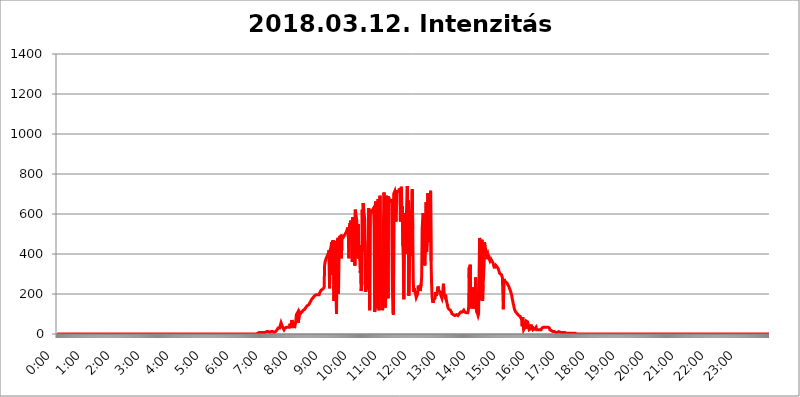
| Category | 2018.03.12. Intenzitás [W/m^2] |
|---|---|
| 0.0 | 0 |
| 0.0006944444444444445 | 0 |
| 0.001388888888888889 | 0 |
| 0.0020833333333333333 | 0 |
| 0.002777777777777778 | 0 |
| 0.003472222222222222 | 0 |
| 0.004166666666666667 | 0 |
| 0.004861111111111111 | 0 |
| 0.005555555555555556 | 0 |
| 0.0062499999999999995 | 0 |
| 0.006944444444444444 | 0 |
| 0.007638888888888889 | 0 |
| 0.008333333333333333 | 0 |
| 0.009027777777777779 | 0 |
| 0.009722222222222222 | 0 |
| 0.010416666666666666 | 0 |
| 0.011111111111111112 | 0 |
| 0.011805555555555555 | 0 |
| 0.012499999999999999 | 0 |
| 0.013194444444444444 | 0 |
| 0.013888888888888888 | 0 |
| 0.014583333333333332 | 0 |
| 0.015277777777777777 | 0 |
| 0.015972222222222224 | 0 |
| 0.016666666666666666 | 0 |
| 0.017361111111111112 | 0 |
| 0.018055555555555557 | 0 |
| 0.01875 | 0 |
| 0.019444444444444445 | 0 |
| 0.02013888888888889 | 0 |
| 0.020833333333333332 | 0 |
| 0.02152777777777778 | 0 |
| 0.022222222222222223 | 0 |
| 0.02291666666666667 | 0 |
| 0.02361111111111111 | 0 |
| 0.024305555555555556 | 0 |
| 0.024999999999999998 | 0 |
| 0.025694444444444447 | 0 |
| 0.02638888888888889 | 0 |
| 0.027083333333333334 | 0 |
| 0.027777777777777776 | 0 |
| 0.02847222222222222 | 0 |
| 0.029166666666666664 | 0 |
| 0.029861111111111113 | 0 |
| 0.030555555555555555 | 0 |
| 0.03125 | 0 |
| 0.03194444444444445 | 0 |
| 0.03263888888888889 | 0 |
| 0.03333333333333333 | 0 |
| 0.034027777777777775 | 0 |
| 0.034722222222222224 | 0 |
| 0.035416666666666666 | 0 |
| 0.036111111111111115 | 0 |
| 0.03680555555555556 | 0 |
| 0.0375 | 0 |
| 0.03819444444444444 | 0 |
| 0.03888888888888889 | 0 |
| 0.03958333333333333 | 0 |
| 0.04027777777777778 | 0 |
| 0.04097222222222222 | 0 |
| 0.041666666666666664 | 0 |
| 0.042361111111111106 | 0 |
| 0.04305555555555556 | 0 |
| 0.043750000000000004 | 0 |
| 0.044444444444444446 | 0 |
| 0.04513888888888889 | 0 |
| 0.04583333333333334 | 0 |
| 0.04652777777777778 | 0 |
| 0.04722222222222222 | 0 |
| 0.04791666666666666 | 0 |
| 0.04861111111111111 | 0 |
| 0.049305555555555554 | 0 |
| 0.049999999999999996 | 0 |
| 0.05069444444444445 | 0 |
| 0.051388888888888894 | 0 |
| 0.052083333333333336 | 0 |
| 0.05277777777777778 | 0 |
| 0.05347222222222222 | 0 |
| 0.05416666666666667 | 0 |
| 0.05486111111111111 | 0 |
| 0.05555555555555555 | 0 |
| 0.05625 | 0 |
| 0.05694444444444444 | 0 |
| 0.057638888888888885 | 0 |
| 0.05833333333333333 | 0 |
| 0.05902777777777778 | 0 |
| 0.059722222222222225 | 0 |
| 0.06041666666666667 | 0 |
| 0.061111111111111116 | 0 |
| 0.06180555555555556 | 0 |
| 0.0625 | 0 |
| 0.06319444444444444 | 0 |
| 0.06388888888888888 | 0 |
| 0.06458333333333334 | 0 |
| 0.06527777777777778 | 0 |
| 0.06597222222222222 | 0 |
| 0.06666666666666667 | 0 |
| 0.06736111111111111 | 0 |
| 0.06805555555555555 | 0 |
| 0.06874999999999999 | 0 |
| 0.06944444444444443 | 0 |
| 0.07013888888888889 | 0 |
| 0.07083333333333333 | 0 |
| 0.07152777777777779 | 0 |
| 0.07222222222222223 | 0 |
| 0.07291666666666667 | 0 |
| 0.07361111111111111 | 0 |
| 0.07430555555555556 | 0 |
| 0.075 | 0 |
| 0.07569444444444444 | 0 |
| 0.0763888888888889 | 0 |
| 0.07708333333333334 | 0 |
| 0.07777777777777778 | 0 |
| 0.07847222222222222 | 0 |
| 0.07916666666666666 | 0 |
| 0.0798611111111111 | 0 |
| 0.08055555555555556 | 0 |
| 0.08125 | 0 |
| 0.08194444444444444 | 0 |
| 0.08263888888888889 | 0 |
| 0.08333333333333333 | 0 |
| 0.08402777777777777 | 0 |
| 0.08472222222222221 | 0 |
| 0.08541666666666665 | 0 |
| 0.08611111111111112 | 0 |
| 0.08680555555555557 | 0 |
| 0.08750000000000001 | 0 |
| 0.08819444444444445 | 0 |
| 0.08888888888888889 | 0 |
| 0.08958333333333333 | 0 |
| 0.09027777777777778 | 0 |
| 0.09097222222222222 | 0 |
| 0.09166666666666667 | 0 |
| 0.09236111111111112 | 0 |
| 0.09305555555555556 | 0 |
| 0.09375 | 0 |
| 0.09444444444444444 | 0 |
| 0.09513888888888888 | 0 |
| 0.09583333333333333 | 0 |
| 0.09652777777777777 | 0 |
| 0.09722222222222222 | 0 |
| 0.09791666666666667 | 0 |
| 0.09861111111111111 | 0 |
| 0.09930555555555555 | 0 |
| 0.09999999999999999 | 0 |
| 0.10069444444444443 | 0 |
| 0.1013888888888889 | 0 |
| 0.10208333333333335 | 0 |
| 0.10277777777777779 | 0 |
| 0.10347222222222223 | 0 |
| 0.10416666666666667 | 0 |
| 0.10486111111111111 | 0 |
| 0.10555555555555556 | 0 |
| 0.10625 | 0 |
| 0.10694444444444444 | 0 |
| 0.1076388888888889 | 0 |
| 0.10833333333333334 | 0 |
| 0.10902777777777778 | 0 |
| 0.10972222222222222 | 0 |
| 0.1111111111111111 | 0 |
| 0.11180555555555556 | 0 |
| 0.11180555555555556 | 0 |
| 0.1125 | 0 |
| 0.11319444444444444 | 0 |
| 0.11388888888888889 | 0 |
| 0.11458333333333333 | 0 |
| 0.11527777777777777 | 0 |
| 0.11597222222222221 | 0 |
| 0.11666666666666665 | 0 |
| 0.1173611111111111 | 0 |
| 0.11805555555555557 | 0 |
| 0.11944444444444445 | 0 |
| 0.12013888888888889 | 0 |
| 0.12083333333333333 | 0 |
| 0.12152777777777778 | 0 |
| 0.12222222222222223 | 0 |
| 0.12291666666666667 | 0 |
| 0.12291666666666667 | 0 |
| 0.12361111111111112 | 0 |
| 0.12430555555555556 | 0 |
| 0.125 | 0 |
| 0.12569444444444444 | 0 |
| 0.12638888888888888 | 0 |
| 0.12708333333333333 | 0 |
| 0.16875 | 0 |
| 0.12847222222222224 | 0 |
| 0.12916666666666668 | 0 |
| 0.12986111111111112 | 0 |
| 0.13055555555555556 | 0 |
| 0.13125 | 0 |
| 0.13194444444444445 | 0 |
| 0.1326388888888889 | 0 |
| 0.13333333333333333 | 0 |
| 0.13402777777777777 | 0 |
| 0.13402777777777777 | 0 |
| 0.13472222222222222 | 0 |
| 0.13541666666666666 | 0 |
| 0.1361111111111111 | 0 |
| 0.13749999999999998 | 0 |
| 0.13819444444444443 | 0 |
| 0.1388888888888889 | 0 |
| 0.13958333333333334 | 0 |
| 0.14027777777777778 | 0 |
| 0.14097222222222222 | 0 |
| 0.14166666666666666 | 0 |
| 0.1423611111111111 | 0 |
| 0.14305555555555557 | 0 |
| 0.14375000000000002 | 0 |
| 0.14444444444444446 | 0 |
| 0.1451388888888889 | 0 |
| 0.1451388888888889 | 0 |
| 0.14652777777777778 | 0 |
| 0.14722222222222223 | 0 |
| 0.14791666666666667 | 0 |
| 0.1486111111111111 | 0 |
| 0.14930555555555555 | 0 |
| 0.15 | 0 |
| 0.15069444444444444 | 0 |
| 0.15138888888888888 | 0 |
| 0.15208333333333332 | 0 |
| 0.15277777777777776 | 0 |
| 0.15347222222222223 | 0 |
| 0.15416666666666667 | 0 |
| 0.15486111111111112 | 0 |
| 0.15555555555555556 | 0 |
| 0.15625 | 0 |
| 0.15694444444444444 | 0 |
| 0.15763888888888888 | 0 |
| 0.15833333333333333 | 0 |
| 0.15902777777777777 | 0 |
| 0.15972222222222224 | 0 |
| 0.16041666666666668 | 0 |
| 0.16111111111111112 | 0 |
| 0.16180555555555556 | 0 |
| 0.1625 | 0 |
| 0.16319444444444445 | 0 |
| 0.1638888888888889 | 0 |
| 0.16458333333333333 | 0 |
| 0.16527777777777777 | 0 |
| 0.16597222222222222 | 0 |
| 0.16666666666666666 | 0 |
| 0.1673611111111111 | 0 |
| 0.16805555555555554 | 0 |
| 0.16874999999999998 | 0 |
| 0.16944444444444443 | 0 |
| 0.17013888888888887 | 0 |
| 0.1708333333333333 | 0 |
| 0.17152777777777775 | 0 |
| 0.17222222222222225 | 0 |
| 0.1729166666666667 | 0 |
| 0.17361111111111113 | 0 |
| 0.17430555555555557 | 0 |
| 0.17500000000000002 | 0 |
| 0.17569444444444446 | 0 |
| 0.1763888888888889 | 0 |
| 0.17708333333333334 | 0 |
| 0.17777777777777778 | 0 |
| 0.17847222222222223 | 0 |
| 0.17916666666666667 | 0 |
| 0.1798611111111111 | 0 |
| 0.18055555555555555 | 0 |
| 0.18125 | 0 |
| 0.18194444444444444 | 0 |
| 0.1826388888888889 | 0 |
| 0.18333333333333335 | 0 |
| 0.1840277777777778 | 0 |
| 0.18472222222222223 | 0 |
| 0.18541666666666667 | 0 |
| 0.18611111111111112 | 0 |
| 0.18680555555555556 | 0 |
| 0.1875 | 0 |
| 0.18819444444444444 | 0 |
| 0.18888888888888888 | 0 |
| 0.18958333333333333 | 0 |
| 0.19027777777777777 | 0 |
| 0.1909722222222222 | 0 |
| 0.19166666666666665 | 0 |
| 0.19236111111111112 | 0 |
| 0.19305555555555554 | 0 |
| 0.19375 | 0 |
| 0.19444444444444445 | 0 |
| 0.1951388888888889 | 0 |
| 0.19583333333333333 | 0 |
| 0.19652777777777777 | 0 |
| 0.19722222222222222 | 0 |
| 0.19791666666666666 | 0 |
| 0.1986111111111111 | 0 |
| 0.19930555555555554 | 0 |
| 0.19999999999999998 | 0 |
| 0.20069444444444443 | 0 |
| 0.20138888888888887 | 0 |
| 0.2020833333333333 | 0 |
| 0.2027777777777778 | 0 |
| 0.2034722222222222 | 0 |
| 0.2041666666666667 | 0 |
| 0.20486111111111113 | 0 |
| 0.20555555555555557 | 0 |
| 0.20625000000000002 | 0 |
| 0.20694444444444446 | 0 |
| 0.2076388888888889 | 0 |
| 0.20833333333333334 | 0 |
| 0.20902777777777778 | 0 |
| 0.20972222222222223 | 0 |
| 0.21041666666666667 | 0 |
| 0.2111111111111111 | 0 |
| 0.21180555555555555 | 0 |
| 0.2125 | 0 |
| 0.21319444444444444 | 0 |
| 0.2138888888888889 | 0 |
| 0.21458333333333335 | 0 |
| 0.2152777777777778 | 0 |
| 0.21597222222222223 | 0 |
| 0.21666666666666667 | 0 |
| 0.21736111111111112 | 0 |
| 0.21805555555555556 | 0 |
| 0.21875 | 0 |
| 0.21944444444444444 | 0 |
| 0.22013888888888888 | 0 |
| 0.22083333333333333 | 0 |
| 0.22152777777777777 | 0 |
| 0.2222222222222222 | 0 |
| 0.22291666666666665 | 0 |
| 0.2236111111111111 | 0 |
| 0.22430555555555556 | 0 |
| 0.225 | 0 |
| 0.22569444444444445 | 0 |
| 0.2263888888888889 | 0 |
| 0.22708333333333333 | 0 |
| 0.22777777777777777 | 0 |
| 0.22847222222222222 | 0 |
| 0.22916666666666666 | 0 |
| 0.2298611111111111 | 0 |
| 0.23055555555555554 | 0 |
| 0.23124999999999998 | 0 |
| 0.23194444444444443 | 0 |
| 0.23263888888888887 | 0 |
| 0.2333333333333333 | 0 |
| 0.2340277777777778 | 0 |
| 0.2347222222222222 | 0 |
| 0.2354166666666667 | 0 |
| 0.23611111111111113 | 0 |
| 0.23680555555555557 | 0 |
| 0.23750000000000002 | 0 |
| 0.23819444444444446 | 0 |
| 0.2388888888888889 | 0 |
| 0.23958333333333334 | 0 |
| 0.24027777777777778 | 0 |
| 0.24097222222222223 | 0 |
| 0.24166666666666667 | 0 |
| 0.2423611111111111 | 0 |
| 0.24305555555555555 | 0 |
| 0.24375 | 0 |
| 0.24444444444444446 | 0 |
| 0.24513888888888888 | 0 |
| 0.24583333333333335 | 0 |
| 0.2465277777777778 | 0 |
| 0.24722222222222223 | 0 |
| 0.24791666666666667 | 0 |
| 0.24861111111111112 | 0 |
| 0.24930555555555556 | 0 |
| 0.25 | 0 |
| 0.25069444444444444 | 0 |
| 0.2513888888888889 | 0 |
| 0.2520833333333333 | 0 |
| 0.25277777777777777 | 0 |
| 0.2534722222222222 | 0 |
| 0.25416666666666665 | 0 |
| 0.2548611111111111 | 0 |
| 0.2555555555555556 | 0 |
| 0.25625000000000003 | 0 |
| 0.2569444444444445 | 0 |
| 0.2576388888888889 | 0 |
| 0.25833333333333336 | 0 |
| 0.2590277777777778 | 0 |
| 0.25972222222222224 | 0 |
| 0.2604166666666667 | 0 |
| 0.2611111111111111 | 0 |
| 0.26180555555555557 | 0 |
| 0.2625 | 0 |
| 0.26319444444444445 | 0 |
| 0.2638888888888889 | 0 |
| 0.26458333333333334 | 0 |
| 0.2652777777777778 | 0 |
| 0.2659722222222222 | 0 |
| 0.26666666666666666 | 0 |
| 0.2673611111111111 | 0 |
| 0.26805555555555555 | 0 |
| 0.26875 | 0 |
| 0.26944444444444443 | 0 |
| 0.2701388888888889 | 0 |
| 0.2708333333333333 | 0 |
| 0.27152777777777776 | 0 |
| 0.2722222222222222 | 0 |
| 0.27291666666666664 | 0 |
| 0.2736111111111111 | 0 |
| 0.2743055555555555 | 0 |
| 0.27499999999999997 | 0 |
| 0.27569444444444446 | 0 |
| 0.27638888888888885 | 0 |
| 0.27708333333333335 | 0 |
| 0.2777777777777778 | 0 |
| 0.27847222222222223 | 0 |
| 0.2791666666666667 | 0 |
| 0.2798611111111111 | 0 |
| 0.28055555555555556 | 3.525 |
| 0.28125 | 3.525 |
| 0.28194444444444444 | 3.525 |
| 0.2826388888888889 | 7.887 |
| 0.2833333333333333 | 7.887 |
| 0.28402777777777777 | 7.887 |
| 0.2847222222222222 | 7.887 |
| 0.28541666666666665 | 7.887 |
| 0.28611111111111115 | 7.887 |
| 0.28680555555555554 | 7.887 |
| 0.28750000000000003 | 7.887 |
| 0.2881944444444445 | 7.887 |
| 0.2888888888888889 | 7.887 |
| 0.28958333333333336 | 7.887 |
| 0.2902777777777778 | 7.887 |
| 0.29097222222222224 | 7.887 |
| 0.2916666666666667 | 7.887 |
| 0.2923611111111111 | 7.887 |
| 0.29305555555555557 | 7.887 |
| 0.29375 | 12.257 |
| 0.29444444444444445 | 12.257 |
| 0.2951388888888889 | 12.257 |
| 0.29583333333333334 | 12.257 |
| 0.2965277777777778 | 7.887 |
| 0.2972222222222222 | 7.887 |
| 0.29791666666666666 | 7.887 |
| 0.2986111111111111 | 7.887 |
| 0.29930555555555555 | 7.887 |
| 0.3 | 12.257 |
| 0.30069444444444443 | 12.257 |
| 0.3013888888888889 | 12.257 |
| 0.3020833333333333 | 12.257 |
| 0.30277777777777776 | 7.887 |
| 0.3034722222222222 | 7.887 |
| 0.30416666666666664 | 7.887 |
| 0.3048611111111111 | 7.887 |
| 0.3055555555555555 | 12.257 |
| 0.30624999999999997 | 12.257 |
| 0.3069444444444444 | 12.257 |
| 0.3076388888888889 | 16.636 |
| 0.30833333333333335 | 21.024 |
| 0.3090277777777778 | 25.419 |
| 0.30972222222222223 | 29.823 |
| 0.3104166666666667 | 29.823 |
| 0.3111111111111111 | 29.823 |
| 0.31180555555555556 | 29.823 |
| 0.3125 | 34.234 |
| 0.31319444444444444 | 34.234 |
| 0.3138888888888889 | 56.398 |
| 0.3145833333333333 | 51.951 |
| 0.31527777777777777 | 43.079 |
| 0.3159722222222222 | 38.653 |
| 0.31666666666666665 | 29.823 |
| 0.31736111111111115 | 25.419 |
| 0.31805555555555554 | 21.024 |
| 0.31875000000000003 | 25.419 |
| 0.3194444444444445 | 29.823 |
| 0.3201388888888889 | 29.823 |
| 0.32083333333333336 | 34.234 |
| 0.3215277777777778 | 34.234 |
| 0.32222222222222224 | 34.234 |
| 0.3229166666666667 | 34.234 |
| 0.3236111111111111 | 34.234 |
| 0.32430555555555557 | 29.823 |
| 0.325 | 38.653 |
| 0.32569444444444445 | 34.234 |
| 0.3263888888888889 | 51.951 |
| 0.32708333333333334 | 43.079 |
| 0.3277777777777778 | 29.823 |
| 0.3284722222222222 | 34.234 |
| 0.32916666666666666 | 69.775 |
| 0.3298611111111111 | 65.31 |
| 0.33055555555555555 | 65.31 |
| 0.33125 | 34.234 |
| 0.33194444444444443 | 51.951 |
| 0.3326388888888889 | 29.823 |
| 0.3333333333333333 | 38.653 |
| 0.3340277777777778 | 51.951 |
| 0.3347222222222222 | 69.775 |
| 0.3354166666666667 | 96.682 |
| 0.3361111111111111 | 101.184 |
| 0.3368055555555556 | 105.69 |
| 0.33749999999999997 | 101.184 |
| 0.33819444444444446 | 56.398 |
| 0.33888888888888885 | 51.951 |
| 0.33958333333333335 | 110.201 |
| 0.34027777777777773 | 105.69 |
| 0.34097222222222223 | 101.184 |
| 0.3416666666666666 | 101.184 |
| 0.3423611111111111 | 105.69 |
| 0.3430555555555555 | 110.201 |
| 0.34375 | 110.201 |
| 0.3444444444444445 | 114.716 |
| 0.3451388888888889 | 119.235 |
| 0.3458333333333334 | 119.235 |
| 0.34652777777777777 | 123.758 |
| 0.34722222222222227 | 123.758 |
| 0.34791666666666665 | 119.235 |
| 0.34861111111111115 | 132.814 |
| 0.34930555555555554 | 132.814 |
| 0.35000000000000003 | 137.347 |
| 0.3506944444444444 | 141.884 |
| 0.3513888888888889 | 141.884 |
| 0.3520833333333333 | 146.423 |
| 0.3527777777777778 | 146.423 |
| 0.3534722222222222 | 150.964 |
| 0.3541666666666667 | 155.509 |
| 0.3548611111111111 | 160.056 |
| 0.35555555555555557 | 164.605 |
| 0.35625 | 169.156 |
| 0.35694444444444445 | 173.709 |
| 0.3576388888888889 | 173.709 |
| 0.35833333333333334 | 178.264 |
| 0.3590277777777778 | 182.82 |
| 0.3597222222222222 | 182.82 |
| 0.36041666666666666 | 187.378 |
| 0.3611111111111111 | 191.937 |
| 0.36180555555555555 | 191.937 |
| 0.3625 | 196.497 |
| 0.36319444444444443 | 196.497 |
| 0.3638888888888889 | 196.497 |
| 0.3645833333333333 | 201.058 |
| 0.3652777777777778 | 196.497 |
| 0.3659722222222222 | 196.497 |
| 0.3666666666666667 | 201.058 |
| 0.3673611111111111 | 196.497 |
| 0.3680555555555556 | 205.62 |
| 0.36874999999999997 | 210.182 |
| 0.36944444444444446 | 210.182 |
| 0.37013888888888885 | 219.309 |
| 0.37083333333333335 | 219.309 |
| 0.37152777777777773 | 223.873 |
| 0.37222222222222223 | 223.873 |
| 0.3729166666666666 | 228.436 |
| 0.3736111111111111 | 228.436 |
| 0.3743055555555555 | 233 |
| 0.375 | 342.162 |
| 0.3756944444444445 | 360.221 |
| 0.3763888888888889 | 364.728 |
| 0.3770833333333334 | 378.224 |
| 0.37777777777777777 | 382.715 |
| 0.37847222222222227 | 387.202 |
| 0.37916666666666665 | 396.164 |
| 0.37986111111111115 | 400.638 |
| 0.38055555555555554 | 405.108 |
| 0.38125000000000003 | 418.492 |
| 0.3819444444444444 | 228.436 |
| 0.3826388888888889 | 418.492 |
| 0.3833333333333333 | 427.39 |
| 0.3840277777777778 | 436.27 |
| 0.3847222222222222 | 458.38 |
| 0.3854166666666667 | 296.808 |
| 0.3861111111111111 | 467.187 |
| 0.38680555555555557 | 449.551 |
| 0.3875 | 467.187 |
| 0.38819444444444445 | 164.605 |
| 0.3888888888888889 | 449.551 |
| 0.38958333333333334 | 449.551 |
| 0.3902777777777778 | 462.786 |
| 0.3909722222222222 | 458.38 |
| 0.39166666666666666 | 101.184 |
| 0.3923611111111111 | 462.786 |
| 0.39305555555555555 | 467.187 |
| 0.39375 | 480.356 |
| 0.39444444444444443 | 201.058 |
| 0.3951388888888889 | 475.972 |
| 0.3958333333333333 | 484.735 |
| 0.3965277777777778 | 489.108 |
| 0.3972222222222222 | 489.108 |
| 0.3979166666666667 | 489.108 |
| 0.3986111111111111 | 378.224 |
| 0.3993055555555556 | 489.108 |
| 0.39999999999999997 | 484.735 |
| 0.40069444444444446 | 489.108 |
| 0.40138888888888885 | 484.735 |
| 0.40208333333333335 | 489.108 |
| 0.40277777777777773 | 493.475 |
| 0.40347222222222223 | 497.836 |
| 0.4041666666666666 | 502.192 |
| 0.4048611111111111 | 506.542 |
| 0.4055555555555555 | 510.885 |
| 0.40625 | 519.555 |
| 0.4069444444444445 | 523.88 |
| 0.4076388888888889 | 532.513 |
| 0.4083333333333334 | 484.735 |
| 0.40902777777777777 | 378.224 |
| 0.40972222222222227 | 519.555 |
| 0.41041666666666665 | 553.986 |
| 0.41111111111111115 | 493.475 |
| 0.41180555555555554 | 566.793 |
| 0.41250000000000003 | 519.555 |
| 0.4131944444444444 | 562.53 |
| 0.4138888888888889 | 360.221 |
| 0.4145833333333333 | 583.779 |
| 0.4152777777777778 | 536.82 |
| 0.4159722222222222 | 562.53 |
| 0.4166666666666667 | 558.261 |
| 0.4173611111111111 | 342.162 |
| 0.41805555555555557 | 621.613 |
| 0.41875 | 600.661 |
| 0.41944444444444445 | 600.661 |
| 0.4201388888888889 | 566.793 |
| 0.42083333333333334 | 378.224 |
| 0.4215277777777778 | 515.223 |
| 0.4222222222222222 | 549.704 |
| 0.42291666666666666 | 378.224 |
| 0.4236111111111111 | 445.129 |
| 0.42430555555555555 | 382.715 |
| 0.425 | 305.898 |
| 0.42569444444444443 | 351.198 |
| 0.4263888888888889 | 214.746 |
| 0.4270833333333333 | 260.373 |
| 0.4277777777777778 | 621.613 |
| 0.4284722222222222 | 414.035 |
| 0.4291666666666667 | 654.791 |
| 0.4298611111111111 | 617.436 |
| 0.4305555555555556 | 596.45 |
| 0.43124999999999997 | 575.299 |
| 0.43194444444444446 | 251.251 |
| 0.43263888888888885 | 210.182 |
| 0.43333333333333335 | 274.047 |
| 0.43402777777777773 | 223.873 |
| 0.43472222222222223 | 242.127 |
| 0.4354166666666666 | 449.551 |
| 0.4361111111111111 | 480.356 |
| 0.4368055555555555 | 629.948 |
| 0.4375 | 422.943 |
| 0.4381944444444445 | 119.235 |
| 0.4388888888888889 | 613.252 |
| 0.4395833333333334 | 621.613 |
| 0.44027777777777777 | 609.062 |
| 0.44097222222222227 | 609.062 |
| 0.44166666666666665 | 617.436 |
| 0.44236111111111115 | 613.252 |
| 0.44305555555555554 | 617.436 |
| 0.44375000000000003 | 629.948 |
| 0.4444444444444444 | 532.513 |
| 0.4451388888888889 | 110.201 |
| 0.4458333333333333 | 128.284 |
| 0.4465277777777778 | 663.019 |
| 0.4472222222222222 | 658.909 |
| 0.4479166666666667 | 667.123 |
| 0.4486111111111111 | 128.284 |
| 0.44930555555555557 | 137.347 |
| 0.45 | 675.311 |
| 0.45069444444444445 | 671.22 |
| 0.4513888888888889 | 119.235 |
| 0.45208333333333334 | 667.123 |
| 0.4527777777777778 | 691.608 |
| 0.4534722222222222 | 242.127 |
| 0.45416666666666666 | 187.378 |
| 0.4548611111111111 | 246.689 |
| 0.45555555555555555 | 237.564 |
| 0.45625 | 119.235 |
| 0.45694444444444443 | 146.423 |
| 0.4576388888888889 | 588.009 |
| 0.4583333333333333 | 707.8 |
| 0.4590277777777778 | 600.661 |
| 0.4597222222222222 | 475.972 |
| 0.4604166666666667 | 132.814 |
| 0.4611111111111111 | 137.347 |
| 0.4618055555555556 | 691.608 |
| 0.46249999999999997 | 219.309 |
| 0.46319444444444446 | 629.948 |
| 0.46388888888888885 | 178.264 |
| 0.46458333333333335 | 687.544 |
| 0.46527777777777773 | 671.22 |
| 0.46597222222222223 | 667.123 |
| 0.4666666666666666 | 663.019 |
| 0.4673611111111111 | 663.019 |
| 0.4680555555555555 | 663.019 |
| 0.46875 | 667.123 |
| 0.4694444444444445 | 675.311 |
| 0.4701388888888889 | 223.873 |
| 0.4708333333333334 | 105.69 |
| 0.47152777777777777 | 96.682 |
| 0.47222222222222227 | 703.762 |
| 0.47291666666666665 | 703.762 |
| 0.47361111111111115 | 715.858 |
| 0.47430555555555554 | 703.762 |
| 0.47500000000000003 | 562.53 |
| 0.4756944444444444 | 663.019 |
| 0.4763888888888889 | 719.877 |
| 0.4770833333333333 | 711.832 |
| 0.4777777777777778 | 707.8 |
| 0.4784722222222222 | 715.858 |
| 0.4791666666666667 | 715.858 |
| 0.4798611111111111 | 727.896 |
| 0.48055555555555557 | 719.877 |
| 0.48125 | 562.53 |
| 0.48194444444444445 | 604.864 |
| 0.4826388888888889 | 735.89 |
| 0.48333333333333334 | 575.299 |
| 0.4840277777777778 | 638.256 |
| 0.4847222222222222 | 440.702 |
| 0.48541666666666666 | 373.729 |
| 0.4861111111111111 | 173.709 |
| 0.48680555555555555 | 506.542 |
| 0.4875 | 604.864 |
| 0.48819444444444443 | 449.551 |
| 0.4888888888888889 | 400.638 |
| 0.4895833333333333 | 575.299 |
| 0.4902777777777778 | 671.22 |
| 0.4909722222222222 | 739.877 |
| 0.4916666666666667 | 575.299 |
| 0.4923611111111111 | 667.123 |
| 0.4930555555555556 | 191.937 |
| 0.49374999999999997 | 187.378 |
| 0.49444444444444446 | 449.551 |
| 0.49513888888888885 | 391.685 |
| 0.49583333333333335 | 549.704 |
| 0.49652777777777773 | 575.299 |
| 0.49722222222222223 | 579.542 |
| 0.4979166666666666 | 723.889 |
| 0.4986111111111111 | 523.88 |
| 0.4993055555555555 | 260.373 |
| 0.5 | 210.182 |
| 0.5006944444444444 | 228.436 |
| 0.5013888888888889 | 214.746 |
| 0.5020833333333333 | 205.62 |
| 0.5027777777777778 | 196.497 |
| 0.5034722222222222 | 182.82 |
| 0.5041666666666667 | 178.264 |
| 0.5048611111111111 | 182.82 |
| 0.5055555555555555 | 201.058 |
| 0.50625 | 242.127 |
| 0.5069444444444444 | 246.689 |
| 0.5076388888888889 | 242.127 |
| 0.5083333333333333 | 223.873 |
| 0.5090277777777777 | 214.746 |
| 0.5097222222222222 | 219.309 |
| 0.5104166666666666 | 251.251 |
| 0.5111111111111112 | 287.709 |
| 0.5118055555555555 | 532.513 |
| 0.5125000000000001 | 562.53 |
| 0.5131944444444444 | 604.864 |
| 0.513888888888889 | 467.187 |
| 0.5145833333333333 | 436.27 |
| 0.5152777777777778 | 342.162 |
| 0.5159722222222222 | 355.712 |
| 0.5166666666666667 | 489.108 |
| 0.517361111111111 | 658.909 |
| 0.5180555555555556 | 409.574 |
| 0.5187499999999999 | 467.187 |
| 0.5194444444444445 | 703.762 |
| 0.5201388888888888 | 691.608 |
| 0.5208333333333334 | 691.608 |
| 0.5215277777777778 | 663.019 |
| 0.5222222222222223 | 458.38 |
| 0.5229166666666667 | 475.972 |
| 0.5236111111111111 | 715.858 |
| 0.5243055555555556 | 364.728 |
| 0.525 | 255.813 |
| 0.5256944444444445 | 187.378 |
| 0.5263888888888889 | 164.605 |
| 0.5270833333333333 | 155.509 |
| 0.5277777777777778 | 169.156 |
| 0.5284722222222222 | 169.156 |
| 0.5291666666666667 | 164.605 |
| 0.5298611111111111 | 178.264 |
| 0.5305555555555556 | 210.182 |
| 0.53125 | 201.058 |
| 0.5319444444444444 | 191.937 |
| 0.5326388888888889 | 205.62 |
| 0.5333333333333333 | 201.058 |
| 0.5340277777777778 | 237.564 |
| 0.5347222222222222 | 219.309 |
| 0.5354166666666667 | 223.873 |
| 0.5361111111111111 | 214.746 |
| 0.5368055555555555 | 210.182 |
| 0.5375 | 210.182 |
| 0.5381944444444444 | 191.937 |
| 0.5388888888888889 | 187.378 |
| 0.5395833333333333 | 178.264 |
| 0.5402777777777777 | 191.937 |
| 0.5409722222222222 | 223.873 |
| 0.5416666666666666 | 251.251 |
| 0.5423611111111112 | 201.058 |
| 0.5430555555555555 | 196.497 |
| 0.5437500000000001 | 187.378 |
| 0.5444444444444444 | 196.497 |
| 0.545138888888889 | 182.82 |
| 0.5458333333333333 | 178.264 |
| 0.5465277777777778 | 155.509 |
| 0.5472222222222222 | 146.423 |
| 0.5479166666666667 | 132.814 |
| 0.548611111111111 | 128.284 |
| 0.5493055555555556 | 123.758 |
| 0.5499999999999999 | 119.235 |
| 0.5506944444444445 | 119.235 |
| 0.5513888888888888 | 119.235 |
| 0.5520833333333334 | 114.716 |
| 0.5527777777777778 | 110.201 |
| 0.5534722222222223 | 101.184 |
| 0.5541666666666667 | 101.184 |
| 0.5548611111111111 | 96.682 |
| 0.5555555555555556 | 96.682 |
| 0.55625 | 96.682 |
| 0.5569444444444445 | 96.682 |
| 0.5576388888888889 | 92.184 |
| 0.5583333333333333 | 92.184 |
| 0.5590277777777778 | 92.184 |
| 0.5597222222222222 | 96.682 |
| 0.5604166666666667 | 96.682 |
| 0.5611111111111111 | 96.682 |
| 0.5618055555555556 | 92.184 |
| 0.5625 | 96.682 |
| 0.5631944444444444 | 96.682 |
| 0.5638888888888889 | 101.184 |
| 0.5645833333333333 | 101.184 |
| 0.5652777777777778 | 105.69 |
| 0.5659722222222222 | 110.201 |
| 0.5666666666666667 | 110.201 |
| 0.5673611111111111 | 110.201 |
| 0.5680555555555555 | 110.201 |
| 0.56875 | 110.201 |
| 0.5694444444444444 | 110.201 |
| 0.5701388888888889 | 119.235 |
| 0.5708333333333333 | 114.716 |
| 0.5715277777777777 | 110.201 |
| 0.5722222222222222 | 105.69 |
| 0.5729166666666666 | 105.69 |
| 0.5736111111111112 | 105.69 |
| 0.5743055555555555 | 101.184 |
| 0.5750000000000001 | 101.184 |
| 0.5756944444444444 | 105.69 |
| 0.576388888888889 | 114.716 |
| 0.5770833333333333 | 137.347 |
| 0.5777777777777778 | 333.113 |
| 0.5784722222222222 | 191.937 |
| 0.5791666666666667 | 346.682 |
| 0.579861111111111 | 146.423 |
| 0.5805555555555556 | 146.423 |
| 0.5812499999999999 | 128.284 |
| 0.5819444444444445 | 173.709 |
| 0.5826388888888888 | 128.284 |
| 0.5833333333333334 | 233 |
| 0.5840277777777778 | 128.284 |
| 0.5847222222222223 | 137.347 |
| 0.5854166666666667 | 160.056 |
| 0.5861111111111111 | 178.264 |
| 0.5868055555555556 | 283.156 |
| 0.5875 | 132.814 |
| 0.5881944444444445 | 110.201 |
| 0.5888888888888889 | 110.201 |
| 0.5895833333333333 | 101.184 |
| 0.5902777777777778 | 92.184 |
| 0.5909722222222222 | 101.184 |
| 0.5916666666666667 | 301.354 |
| 0.5923611111111111 | 480.356 |
| 0.5930555555555556 | 445.129 |
| 0.59375 | 319.517 |
| 0.5944444444444444 | 169.156 |
| 0.5951388888888889 | 333.113 |
| 0.5958333333333333 | 471.582 |
| 0.5965277777777778 | 164.605 |
| 0.5972222222222222 | 246.689 |
| 0.5979166666666667 | 287.709 |
| 0.5986111111111111 | 346.682 |
| 0.5993055555555555 | 458.38 |
| 0.6 | 436.27 |
| 0.6006944444444444 | 431.833 |
| 0.6013888888888889 | 418.492 |
| 0.6020833333333333 | 391.685 |
| 0.6027777777777777 | 391.685 |
| 0.6034722222222222 | 400.638 |
| 0.6041666666666666 | 373.729 |
| 0.6048611111111112 | 396.164 |
| 0.6055555555555555 | 378.224 |
| 0.6062500000000001 | 378.224 |
| 0.6069444444444444 | 364.728 |
| 0.607638888888889 | 364.728 |
| 0.6083333333333333 | 373.729 |
| 0.6090277777777778 | 369.23 |
| 0.6097222222222222 | 364.728 |
| 0.6104166666666667 | 360.221 |
| 0.611111111111111 | 355.712 |
| 0.6118055555555556 | 355.712 |
| 0.6124999999999999 | 355.712 |
| 0.6131944444444445 | 328.584 |
| 0.6138888888888888 | 346.682 |
| 0.6145833333333334 | 333.113 |
| 0.6152777777777778 | 342.162 |
| 0.6159722222222223 | 342.162 |
| 0.6166666666666667 | 346.682 |
| 0.6173611111111111 | 333.113 |
| 0.6180555555555556 | 328.584 |
| 0.61875 | 324.052 |
| 0.6194444444444445 | 314.98 |
| 0.6201388888888889 | 310.44 |
| 0.6208333333333333 | 301.354 |
| 0.6215277777777778 | 305.898 |
| 0.6222222222222222 | 301.354 |
| 0.6229166666666667 | 296.808 |
| 0.6236111111111111 | 296.808 |
| 0.6243055555555556 | 283.156 |
| 0.625 | 283.156 |
| 0.6256944444444444 | 123.758 |
| 0.6263888888888889 | 274.047 |
| 0.6270833333333333 | 274.047 |
| 0.6277777777777778 | 269.49 |
| 0.6284722222222222 | 260.373 |
| 0.6291666666666667 | 260.373 |
| 0.6298611111111111 | 260.373 |
| 0.6305555555555555 | 255.813 |
| 0.63125 | 251.251 |
| 0.6319444444444444 | 246.689 |
| 0.6326388888888889 | 242.127 |
| 0.6333333333333333 | 237.564 |
| 0.6340277777777777 | 233 |
| 0.6347222222222222 | 223.873 |
| 0.6354166666666666 | 219.309 |
| 0.6361111111111112 | 210.182 |
| 0.6368055555555555 | 201.058 |
| 0.6375000000000001 | 191.937 |
| 0.6381944444444444 | 173.709 |
| 0.638888888888889 | 164.605 |
| 0.6395833333333333 | 150.964 |
| 0.6402777777777778 | 141.884 |
| 0.6409722222222222 | 128.284 |
| 0.6416666666666667 | 119.235 |
| 0.642361111111111 | 114.716 |
| 0.6430555555555556 | 110.201 |
| 0.6437499999999999 | 105.69 |
| 0.6444444444444445 | 105.69 |
| 0.6451388888888888 | 101.184 |
| 0.6458333333333334 | 101.184 |
| 0.6465277777777778 | 96.682 |
| 0.6472222222222223 | 92.184 |
| 0.6479166666666667 | 92.184 |
| 0.6486111111111111 | 87.692 |
| 0.6493055555555556 | 87.692 |
| 0.65 | 87.692 |
| 0.6506944444444445 | 87.692 |
| 0.6513888888888889 | 69.775 |
| 0.6520833333333333 | 38.653 |
| 0.6527777777777778 | 83.205 |
| 0.6534722222222222 | 78.722 |
| 0.6541666666666667 | 21.024 |
| 0.6548611111111111 | 21.024 |
| 0.6555555555555556 | 21.024 |
| 0.65625 | 34.234 |
| 0.6569444444444444 | 25.419 |
| 0.6576388888888889 | 65.31 |
| 0.6583333333333333 | 65.31 |
| 0.6590277777777778 | 60.85 |
| 0.6597222222222222 | 60.85 |
| 0.6604166666666667 | 60.85 |
| 0.6611111111111111 | 56.398 |
| 0.6618055555555555 | 21.024 |
| 0.6625 | 21.024 |
| 0.6631944444444444 | 21.024 |
| 0.6638888888888889 | 25.419 |
| 0.6645833333333333 | 47.511 |
| 0.6652777777777777 | 25.419 |
| 0.6659722222222222 | 38.653 |
| 0.6666666666666666 | 43.079 |
| 0.6673611111111111 | 21.024 |
| 0.6680555555555556 | 21.024 |
| 0.6687500000000001 | 21.024 |
| 0.6694444444444444 | 25.419 |
| 0.6701388888888888 | 21.024 |
| 0.6708333333333334 | 25.419 |
| 0.6715277777777778 | 34.234 |
| 0.6722222222222222 | 21.024 |
| 0.6729166666666666 | 21.024 |
| 0.6736111111111112 | 21.024 |
| 0.6743055555555556 | 21.024 |
| 0.6749999999999999 | 21.024 |
| 0.6756944444444444 | 21.024 |
| 0.6763888888888889 | 21.024 |
| 0.6770833333333334 | 21.024 |
| 0.6777777777777777 | 21.024 |
| 0.6784722222222223 | 21.024 |
| 0.6791666666666667 | 21.024 |
| 0.6798611111111111 | 29.823 |
| 0.6805555555555555 | 25.419 |
| 0.68125 | 29.823 |
| 0.6819444444444445 | 34.234 |
| 0.6826388888888889 | 29.823 |
| 0.6833333333333332 | 34.234 |
| 0.6840277777777778 | 34.234 |
| 0.6847222222222222 | 34.234 |
| 0.6854166666666667 | 34.234 |
| 0.686111111111111 | 34.234 |
| 0.6868055555555556 | 34.234 |
| 0.6875 | 34.234 |
| 0.6881944444444444 | 34.234 |
| 0.688888888888889 | 34.234 |
| 0.6895833333333333 | 29.823 |
| 0.6902777777777778 | 29.823 |
| 0.6909722222222222 | 21.024 |
| 0.6916666666666668 | 21.024 |
| 0.6923611111111111 | 16.636 |
| 0.6930555555555555 | 16.636 |
| 0.69375 | 16.636 |
| 0.6944444444444445 | 12.257 |
| 0.6951388888888889 | 12.257 |
| 0.6958333333333333 | 12.257 |
| 0.6965277777777777 | 12.257 |
| 0.6972222222222223 | 12.257 |
| 0.6979166666666666 | 12.257 |
| 0.6986111111111111 | 12.257 |
| 0.6993055555555556 | 7.887 |
| 0.7000000000000001 | 7.887 |
| 0.7006944444444444 | 7.887 |
| 0.7013888888888888 | 7.887 |
| 0.7020833333333334 | 7.887 |
| 0.7027777777777778 | 7.887 |
| 0.7034722222222222 | 12.257 |
| 0.7041666666666666 | 12.257 |
| 0.7048611111111112 | 12.257 |
| 0.7055555555555556 | 7.887 |
| 0.7062499999999999 | 7.887 |
| 0.7069444444444444 | 7.887 |
| 0.7076388888888889 | 7.887 |
| 0.7083333333333334 | 7.887 |
| 0.7090277777777777 | 7.887 |
| 0.7097222222222223 | 7.887 |
| 0.7104166666666667 | 7.887 |
| 0.7111111111111111 | 7.887 |
| 0.7118055555555555 | 7.887 |
| 0.7125 | 7.887 |
| 0.7131944444444445 | 7.887 |
| 0.7138888888888889 | 3.525 |
| 0.7145833333333332 | 3.525 |
| 0.7152777777777778 | 3.525 |
| 0.7159722222222222 | 3.525 |
| 0.7166666666666667 | 3.525 |
| 0.717361111111111 | 3.525 |
| 0.7180555555555556 | 3.525 |
| 0.71875 | 3.525 |
| 0.7194444444444444 | 3.525 |
| 0.720138888888889 | 3.525 |
| 0.7208333333333333 | 3.525 |
| 0.7215277777777778 | 3.525 |
| 0.7222222222222222 | 3.525 |
| 0.7229166666666668 | 3.525 |
| 0.7236111111111111 | 3.525 |
| 0.7243055555555555 | 3.525 |
| 0.725 | 3.525 |
| 0.7256944444444445 | 3.525 |
| 0.7263888888888889 | 3.525 |
| 0.7270833333333333 | 3.525 |
| 0.7277777777777777 | 0 |
| 0.7284722222222223 | 0 |
| 0.7291666666666666 | 0 |
| 0.7298611111111111 | 0 |
| 0.7305555555555556 | 0 |
| 0.7312500000000001 | 0 |
| 0.7319444444444444 | 0 |
| 0.7326388888888888 | 0 |
| 0.7333333333333334 | 0 |
| 0.7340277777777778 | 0 |
| 0.7347222222222222 | 0 |
| 0.7354166666666666 | 0 |
| 0.7361111111111112 | 0 |
| 0.7368055555555556 | 0 |
| 0.7374999999999999 | 0 |
| 0.7381944444444444 | 0 |
| 0.7388888888888889 | 0 |
| 0.7395833333333334 | 0 |
| 0.7402777777777777 | 0 |
| 0.7409722222222223 | 0 |
| 0.7416666666666667 | 0 |
| 0.7423611111111111 | 0 |
| 0.7430555555555555 | 0 |
| 0.74375 | 0 |
| 0.7444444444444445 | 0 |
| 0.7451388888888889 | 0 |
| 0.7458333333333332 | 0 |
| 0.7465277777777778 | 0 |
| 0.7472222222222222 | 0 |
| 0.7479166666666667 | 0 |
| 0.748611111111111 | 0 |
| 0.7493055555555556 | 0 |
| 0.75 | 0 |
| 0.7506944444444444 | 0 |
| 0.751388888888889 | 0 |
| 0.7520833333333333 | 0 |
| 0.7527777777777778 | 0 |
| 0.7534722222222222 | 0 |
| 0.7541666666666668 | 0 |
| 0.7548611111111111 | 0 |
| 0.7555555555555555 | 0 |
| 0.75625 | 0 |
| 0.7569444444444445 | 0 |
| 0.7576388888888889 | 0 |
| 0.7583333333333333 | 0 |
| 0.7590277777777777 | 0 |
| 0.7597222222222223 | 0 |
| 0.7604166666666666 | 0 |
| 0.7611111111111111 | 0 |
| 0.7618055555555556 | 0 |
| 0.7625000000000001 | 0 |
| 0.7631944444444444 | 0 |
| 0.7638888888888888 | 0 |
| 0.7645833333333334 | 0 |
| 0.7652777777777778 | 0 |
| 0.7659722222222222 | 0 |
| 0.7666666666666666 | 0 |
| 0.7673611111111112 | 0 |
| 0.7680555555555556 | 0 |
| 0.7687499999999999 | 0 |
| 0.7694444444444444 | 0 |
| 0.7701388888888889 | 0 |
| 0.7708333333333334 | 0 |
| 0.7715277777777777 | 0 |
| 0.7722222222222223 | 0 |
| 0.7729166666666667 | 0 |
| 0.7736111111111111 | 0 |
| 0.7743055555555555 | 0 |
| 0.775 | 0 |
| 0.7756944444444445 | 0 |
| 0.7763888888888889 | 0 |
| 0.7770833333333332 | 0 |
| 0.7777777777777778 | 0 |
| 0.7784722222222222 | 0 |
| 0.7791666666666667 | 0 |
| 0.779861111111111 | 0 |
| 0.7805555555555556 | 0 |
| 0.78125 | 0 |
| 0.7819444444444444 | 0 |
| 0.782638888888889 | 0 |
| 0.7833333333333333 | 0 |
| 0.7840277777777778 | 0 |
| 0.7847222222222222 | 0 |
| 0.7854166666666668 | 0 |
| 0.7861111111111111 | 0 |
| 0.7868055555555555 | 0 |
| 0.7875 | 0 |
| 0.7881944444444445 | 0 |
| 0.7888888888888889 | 0 |
| 0.7895833333333333 | 0 |
| 0.7902777777777777 | 0 |
| 0.7909722222222223 | 0 |
| 0.7916666666666666 | 0 |
| 0.7923611111111111 | 0 |
| 0.7930555555555556 | 0 |
| 0.7937500000000001 | 0 |
| 0.7944444444444444 | 0 |
| 0.7951388888888888 | 0 |
| 0.7958333333333334 | 0 |
| 0.7965277777777778 | 0 |
| 0.7972222222222222 | 0 |
| 0.7979166666666666 | 0 |
| 0.7986111111111112 | 0 |
| 0.7993055555555556 | 0 |
| 0.7999999999999999 | 0 |
| 0.8006944444444444 | 0 |
| 0.8013888888888889 | 0 |
| 0.8020833333333334 | 0 |
| 0.8027777777777777 | 0 |
| 0.8034722222222223 | 0 |
| 0.8041666666666667 | 0 |
| 0.8048611111111111 | 0 |
| 0.8055555555555555 | 0 |
| 0.80625 | 0 |
| 0.8069444444444445 | 0 |
| 0.8076388888888889 | 0 |
| 0.8083333333333332 | 0 |
| 0.8090277777777778 | 0 |
| 0.8097222222222222 | 0 |
| 0.8104166666666667 | 0 |
| 0.811111111111111 | 0 |
| 0.8118055555555556 | 0 |
| 0.8125 | 0 |
| 0.8131944444444444 | 0 |
| 0.813888888888889 | 0 |
| 0.8145833333333333 | 0 |
| 0.8152777777777778 | 0 |
| 0.8159722222222222 | 0 |
| 0.8166666666666668 | 0 |
| 0.8173611111111111 | 0 |
| 0.8180555555555555 | 0 |
| 0.81875 | 0 |
| 0.8194444444444445 | 0 |
| 0.8201388888888889 | 0 |
| 0.8208333333333333 | 0 |
| 0.8215277777777777 | 0 |
| 0.8222222222222223 | 0 |
| 0.8229166666666666 | 0 |
| 0.8236111111111111 | 0 |
| 0.8243055555555556 | 0 |
| 0.8250000000000001 | 0 |
| 0.8256944444444444 | 0 |
| 0.8263888888888888 | 0 |
| 0.8270833333333334 | 0 |
| 0.8277777777777778 | 0 |
| 0.8284722222222222 | 0 |
| 0.8291666666666666 | 0 |
| 0.8298611111111112 | 0 |
| 0.8305555555555556 | 0 |
| 0.8312499999999999 | 0 |
| 0.8319444444444444 | 0 |
| 0.8326388888888889 | 0 |
| 0.8333333333333334 | 0 |
| 0.8340277777777777 | 0 |
| 0.8347222222222223 | 0 |
| 0.8354166666666667 | 0 |
| 0.8361111111111111 | 0 |
| 0.8368055555555555 | 0 |
| 0.8375 | 0 |
| 0.8381944444444445 | 0 |
| 0.8388888888888889 | 0 |
| 0.8395833333333332 | 0 |
| 0.8402777777777778 | 0 |
| 0.8409722222222222 | 0 |
| 0.8416666666666667 | 0 |
| 0.842361111111111 | 0 |
| 0.8430555555555556 | 0 |
| 0.84375 | 0 |
| 0.8444444444444444 | 0 |
| 0.845138888888889 | 0 |
| 0.8458333333333333 | 0 |
| 0.8465277777777778 | 0 |
| 0.8472222222222222 | 0 |
| 0.8479166666666668 | 0 |
| 0.8486111111111111 | 0 |
| 0.8493055555555555 | 0 |
| 0.85 | 0 |
| 0.8506944444444445 | 0 |
| 0.8513888888888889 | 0 |
| 0.8520833333333333 | 0 |
| 0.8527777777777777 | 0 |
| 0.8534722222222223 | 0 |
| 0.8541666666666666 | 0 |
| 0.8548611111111111 | 0 |
| 0.8555555555555556 | 0 |
| 0.8562500000000001 | 0 |
| 0.8569444444444444 | 0 |
| 0.8576388888888888 | 0 |
| 0.8583333333333334 | 0 |
| 0.8590277777777778 | 0 |
| 0.8597222222222222 | 0 |
| 0.8604166666666666 | 0 |
| 0.8611111111111112 | 0 |
| 0.8618055555555556 | 0 |
| 0.8624999999999999 | 0 |
| 0.8631944444444444 | 0 |
| 0.8638888888888889 | 0 |
| 0.8645833333333334 | 0 |
| 0.8652777777777777 | 0 |
| 0.8659722222222223 | 0 |
| 0.8666666666666667 | 0 |
| 0.8673611111111111 | 0 |
| 0.8680555555555555 | 0 |
| 0.86875 | 0 |
| 0.8694444444444445 | 0 |
| 0.8701388888888889 | 0 |
| 0.8708333333333332 | 0 |
| 0.8715277777777778 | 0 |
| 0.8722222222222222 | 0 |
| 0.8729166666666667 | 0 |
| 0.873611111111111 | 0 |
| 0.8743055555555556 | 0 |
| 0.875 | 0 |
| 0.8756944444444444 | 0 |
| 0.876388888888889 | 0 |
| 0.8770833333333333 | 0 |
| 0.8777777777777778 | 0 |
| 0.8784722222222222 | 0 |
| 0.8791666666666668 | 0 |
| 0.8798611111111111 | 0 |
| 0.8805555555555555 | 0 |
| 0.88125 | 0 |
| 0.8819444444444445 | 0 |
| 0.8826388888888889 | 0 |
| 0.8833333333333333 | 0 |
| 0.8840277777777777 | 0 |
| 0.8847222222222223 | 0 |
| 0.8854166666666666 | 0 |
| 0.8861111111111111 | 0 |
| 0.8868055555555556 | 0 |
| 0.8875000000000001 | 0 |
| 0.8881944444444444 | 0 |
| 0.8888888888888888 | 0 |
| 0.8895833333333334 | 0 |
| 0.8902777777777778 | 0 |
| 0.8909722222222222 | 0 |
| 0.8916666666666666 | 0 |
| 0.8923611111111112 | 0 |
| 0.8930555555555556 | 0 |
| 0.8937499999999999 | 0 |
| 0.8944444444444444 | 0 |
| 0.8951388888888889 | 0 |
| 0.8958333333333334 | 0 |
| 0.8965277777777777 | 0 |
| 0.8972222222222223 | 0 |
| 0.8979166666666667 | 0 |
| 0.8986111111111111 | 0 |
| 0.8993055555555555 | 0 |
| 0.9 | 0 |
| 0.9006944444444445 | 0 |
| 0.9013888888888889 | 0 |
| 0.9020833333333332 | 0 |
| 0.9027777777777778 | 0 |
| 0.9034722222222222 | 0 |
| 0.9041666666666667 | 0 |
| 0.904861111111111 | 0 |
| 0.9055555555555556 | 0 |
| 0.90625 | 0 |
| 0.9069444444444444 | 0 |
| 0.907638888888889 | 0 |
| 0.9083333333333333 | 0 |
| 0.9090277777777778 | 0 |
| 0.9097222222222222 | 0 |
| 0.9104166666666668 | 0 |
| 0.9111111111111111 | 0 |
| 0.9118055555555555 | 0 |
| 0.9125 | 0 |
| 0.9131944444444445 | 0 |
| 0.9138888888888889 | 0 |
| 0.9145833333333333 | 0 |
| 0.9152777777777777 | 0 |
| 0.9159722222222223 | 0 |
| 0.9166666666666666 | 0 |
| 0.9173611111111111 | 0 |
| 0.9180555555555556 | 0 |
| 0.9187500000000001 | 0 |
| 0.9194444444444444 | 0 |
| 0.9201388888888888 | 0 |
| 0.9208333333333334 | 0 |
| 0.9215277777777778 | 0 |
| 0.9222222222222222 | 0 |
| 0.9229166666666666 | 0 |
| 0.9236111111111112 | 0 |
| 0.9243055555555556 | 0 |
| 0.9249999999999999 | 0 |
| 0.9256944444444444 | 0 |
| 0.9263888888888889 | 0 |
| 0.9270833333333334 | 0 |
| 0.9277777777777777 | 0 |
| 0.9284722222222223 | 0 |
| 0.9291666666666667 | 0 |
| 0.9298611111111111 | 0 |
| 0.9305555555555555 | 0 |
| 0.93125 | 0 |
| 0.9319444444444445 | 0 |
| 0.9326388888888889 | 0 |
| 0.9333333333333332 | 0 |
| 0.9340277777777778 | 0 |
| 0.9347222222222222 | 0 |
| 0.9354166666666667 | 0 |
| 0.936111111111111 | 0 |
| 0.9368055555555556 | 0 |
| 0.9375 | 0 |
| 0.9381944444444444 | 0 |
| 0.938888888888889 | 0 |
| 0.9395833333333333 | 0 |
| 0.9402777777777778 | 0 |
| 0.9409722222222222 | 0 |
| 0.9416666666666668 | 0 |
| 0.9423611111111111 | 0 |
| 0.9430555555555555 | 0 |
| 0.94375 | 0 |
| 0.9444444444444445 | 0 |
| 0.9451388888888889 | 0 |
| 0.9458333333333333 | 0 |
| 0.9465277777777777 | 0 |
| 0.9472222222222223 | 0 |
| 0.9479166666666666 | 0 |
| 0.9486111111111111 | 0 |
| 0.9493055555555556 | 0 |
| 0.9500000000000001 | 0 |
| 0.9506944444444444 | 0 |
| 0.9513888888888888 | 0 |
| 0.9520833333333334 | 0 |
| 0.9527777777777778 | 0 |
| 0.9534722222222222 | 0 |
| 0.9541666666666666 | 0 |
| 0.9548611111111112 | 0 |
| 0.9555555555555556 | 0 |
| 0.9562499999999999 | 0 |
| 0.9569444444444444 | 0 |
| 0.9576388888888889 | 0 |
| 0.9583333333333334 | 0 |
| 0.9590277777777777 | 0 |
| 0.9597222222222223 | 0 |
| 0.9604166666666667 | 0 |
| 0.9611111111111111 | 0 |
| 0.9618055555555555 | 0 |
| 0.9625 | 0 |
| 0.9631944444444445 | 0 |
| 0.9638888888888889 | 0 |
| 0.9645833333333332 | 0 |
| 0.9652777777777778 | 0 |
| 0.9659722222222222 | 0 |
| 0.9666666666666667 | 0 |
| 0.967361111111111 | 0 |
| 0.9680555555555556 | 0 |
| 0.96875 | 0 |
| 0.9694444444444444 | 0 |
| 0.970138888888889 | 0 |
| 0.9708333333333333 | 0 |
| 0.9715277777777778 | 0 |
| 0.9722222222222222 | 0 |
| 0.9729166666666668 | 0 |
| 0.9736111111111111 | 0 |
| 0.9743055555555555 | 0 |
| 0.975 | 0 |
| 0.9756944444444445 | 0 |
| 0.9763888888888889 | 0 |
| 0.9770833333333333 | 0 |
| 0.9777777777777777 | 0 |
| 0.9784722222222223 | 0 |
| 0.9791666666666666 | 0 |
| 0.9798611111111111 | 0 |
| 0.9805555555555556 | 0 |
| 0.9812500000000001 | 0 |
| 0.9819444444444444 | 0 |
| 0.9826388888888888 | 0 |
| 0.9833333333333334 | 0 |
| 0.9840277777777778 | 0 |
| 0.9847222222222222 | 0 |
| 0.9854166666666666 | 0 |
| 0.9861111111111112 | 0 |
| 0.9868055555555556 | 0 |
| 0.9874999999999999 | 0 |
| 0.9881944444444444 | 0 |
| 0.9888888888888889 | 0 |
| 0.9895833333333334 | 0 |
| 0.9902777777777777 | 0 |
| 0.9909722222222223 | 0 |
| 0.9916666666666667 | 0 |
| 0.9923611111111111 | 0 |
| 0.9930555555555555 | 0 |
| 0.99375 | 0 |
| 0.9944444444444445 | 0 |
| 0.9951388888888889 | 0 |
| 0.9958333333333332 | 0 |
| 0.9965277777777778 | 0 |
| 0.9972222222222222 | 0 |
| 0.9979166666666667 | 0 |
| 0.998611111111111 | 0 |
| 0.9993055555555556 | 0 |